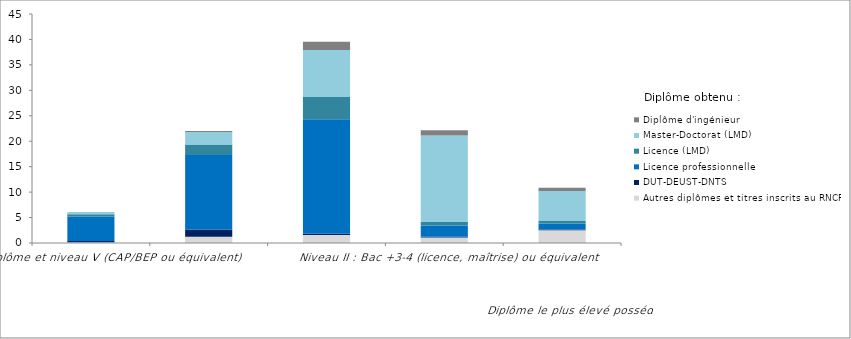
| Category | Autres diplômes et titres inscrits au RNCP | DUT-DEUST-DNTS | Licence professionnelle | Licence (LMD) | Master-Doctorat (LMD) | Diplôme d'ingénieur |
|---|---|---|---|---|---|---|
| Sans diplôme et niveau V (CAP/BEP ou équivalent) | 0.17 | 0.2 | 4.82 | 0.48 | 0.4 | 0 |
| Niveau IV : Bac, ESEU, DAEU ou équivelant  | 1.25 | 1.33 | 14.71 | 2.07 | 2.47 | 0.17 |
| Niveau III : Bac +2 (DUT, BTS, DEUG) ou équivalent | 1.56 | 0.28 | 22.47 | 4.36 | 9.24 | 1.62 |
| Niveau II : Bac +3-4 (licence, maîtrise) ou équivalent  | 1.08 | 0.14 | 2.21 | 0.68 | 17 | 1.05 |
| Niveau I : Bac +5 et plus (master, diplôme d'ingénieur, doctorat) ou équivalent  | 2.49 | 0.14 | 1.19 | 0.51 | 5.89 | 0.65 |